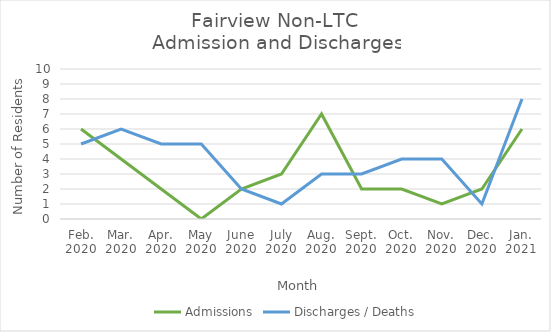
| Category | Admissions | Discharges / Deaths |
|---|---|---|
| Feb.
2020 | 6 | 5 |
| Mar.
2020 | 4 | 6 |
| Apr.
2020 | 2 | 5 |
| May
2020 | 0 | 5 |
| June
2020 | 2 | 2 |
| July
2020 | 3 | 1 |
| Aug.
2020 | 7 | 3 |
| Sept.
2020 | 2 | 3 |
| Oct.
2020 | 2 | 4 |
| Nov.
2020 | 1 | 4 |
| Dec.
2020 | 2 | 1 |
| Jan.
2021 | 6 | 8 |